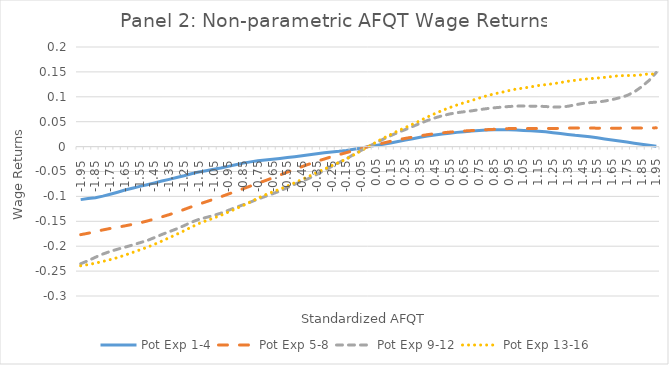
| Category | Pot Exp 1-4 | Pot Exp 5-8 | Pot Exp 9-12 | Pot Exp 13-16 |
|---|---|---|---|---|
| -1.95 | -0.106 | -0.177 | -0.235 | -0.239 |
| -1.9 | -0.104 | -0.174 | -0.229 | -0.237 |
| -1.8499999999999999 | -0.103 | -0.171 | -0.222 | -0.234 |
| -1.7999999999999998 | -0.1 | -0.167 | -0.216 | -0.231 |
| -1.7499999999999998 | -0.096 | -0.164 | -0.211 | -0.227 |
| -1.6999999999999997 | -0.092 | -0.162 | -0.206 | -0.223 |
| -1.6499999999999997 | -0.087 | -0.159 | -0.202 | -0.218 |
| -1.5999999999999996 | -0.084 | -0.156 | -0.198 | -0.213 |
| -1.5499999999999996 | -0.08 | -0.153 | -0.193 | -0.207 |
| -1.4999999999999996 | -0.077 | -0.15 | -0.189 | -0.202 |
| -1.4499999999999995 | -0.073 | -0.145 | -0.183 | -0.196 |
| -1.3999999999999995 | -0.069 | -0.141 | -0.176 | -0.19 |
| -1.3499999999999994 | -0.066 | -0.137 | -0.171 | -0.183 |
| -1.2999999999999994 | -0.062 | -0.132 | -0.165 | -0.176 |
| -1.2499999999999993 | -0.059 | -0.126 | -0.159 | -0.169 |
| -1.1999999999999993 | -0.054 | -0.121 | -0.152 | -0.162 |
| -1.1499999999999992 | -0.051 | -0.116 | -0.146 | -0.155 |
| -1.0999999999999992 | -0.048 | -0.111 | -0.142 | -0.149 |
| -1.0499999999999992 | -0.046 | -0.106 | -0.138 | -0.144 |
| -0.9999999999999991 | -0.043 | -0.101 | -0.134 | -0.138 |
| -0.9499999999999991 | -0.04 | -0.095 | -0.128 | -0.132 |
| -0.899999999999999 | -0.036 | -0.09 | -0.122 | -0.125 |
| -0.849999999999999 | -0.033 | -0.085 | -0.117 | -0.118 |
| -0.7999999999999989 | -0.031 | -0.079 | -0.111 | -0.111 |
| -0.7499999999999989 | -0.029 | -0.074 | -0.105 | -0.104 |
| -0.6999999999999988 | -0.027 | -0.068 | -0.1 | -0.097 |
| -0.6499999999999988 | -0.026 | -0.063 | -0.095 | -0.091 |
| -0.5999999999999988 | -0.024 | -0.057 | -0.089 | -0.085 |
| -0.5499999999999987 | -0.022 | -0.051 | -0.082 | -0.079 |
| -0.4999999999999987 | -0.02 | -0.046 | -0.076 | -0.073 |
| -0.44999999999999873 | -0.018 | -0.04 | -0.069 | -0.066 |
| -0.39999999999999875 | -0.016 | -0.035 | -0.063 | -0.059 |
| -0.34999999999999876 | -0.014 | -0.03 | -0.056 | -0.052 |
| -0.29999999999999877 | -0.012 | -0.025 | -0.048 | -0.045 |
| -0.24999999999999878 | -0.011 | -0.02 | -0.04 | -0.038 |
| -0.1999999999999988 | -0.009 | -0.016 | -0.032 | -0.032 |
| -0.1499999999999988 | -0.008 | -0.012 | -0.024 | -0.025 |
| -0.0999999999999988 | -0.005 | -0.008 | -0.016 | -0.017 |
| -0.049999999999998795 | -0.003 | -0.004 | -0.008 | -0.008 |
| 0.0 | 0 | 0 | 0 | 0 |
| 0.05 | 0.002 | 0.004 | 0.008 | 0.009 |
| 0.1 | 0.005 | 0.007 | 0.015 | 0.017 |
| 0.15000000000000002 | 0.007 | 0.011 | 0.022 | 0.024 |
| 0.2 | 0.01 | 0.014 | 0.028 | 0.032 |
| 0.25 | 0.013 | 0.017 | 0.034 | 0.038 |
| 0.3 | 0.016 | 0.019 | 0.041 | 0.045 |
| 0.35 | 0.019 | 0.022 | 0.047 | 0.052 |
| 0.39999999999999997 | 0.021 | 0.024 | 0.053 | 0.06 |
| 0.44999999999999996 | 0.023 | 0.026 | 0.058 | 0.066 |
| 0.49999999999999994 | 0.025 | 0.028 | 0.062 | 0.073 |
| 0.5499999999999999 | 0.027 | 0.029 | 0.066 | 0.078 |
| 0.6 | 0.029 | 0.03 | 0.068 | 0.084 |
| 0.65 | 0.03 | 0.031 | 0.07 | 0.088 |
| 0.7000000000000001 | 0.031 | 0.032 | 0.072 | 0.093 |
| 0.7500000000000001 | 0.032 | 0.033 | 0.074 | 0.097 |
| 0.8000000000000002 | 0.033 | 0.034 | 0.076 | 0.102 |
| 0.8500000000000002 | 0.034 | 0.035 | 0.078 | 0.106 |
| 0.9000000000000002 | 0.034 | 0.035 | 0.079 | 0.109 |
| 0.9500000000000003 | 0.034 | 0.036 | 0.08 | 0.112 |
| 1.0000000000000002 | 0.033 | 0.036 | 0.081 | 0.115 |
| 1.0500000000000003 | 0.033 | 0.036 | 0.081 | 0.118 |
| 1.1000000000000003 | 0.032 | 0.036 | 0.081 | 0.12 |
| 1.1500000000000004 | 0.031 | 0.036 | 0.081 | 0.123 |
| 1.2000000000000004 | 0.03 | 0.037 | 0.08 | 0.124 |
| 1.2500000000000004 | 0.028 | 0.036 | 0.079 | 0.126 |
| 1.3000000000000005 | 0.026 | 0.037 | 0.08 | 0.129 |
| 1.3500000000000005 | 0.024 | 0.037 | 0.081 | 0.131 |
| 1.4000000000000006 | 0.023 | 0.037 | 0.084 | 0.133 |
| 1.4500000000000006 | 0.021 | 0.037 | 0.087 | 0.135 |
| 1.5000000000000007 | 0.02 | 0.037 | 0.088 | 0.136 |
| 1.5500000000000007 | 0.018 | 0.037 | 0.09 | 0.138 |
| 1.6000000000000008 | 0.015 | 0.037 | 0.091 | 0.139 |
| 1.6500000000000008 | 0.013 | 0.037 | 0.094 | 0.141 |
| 1.7000000000000008 | 0.011 | 0.037 | 0.098 | 0.142 |
| 1.7500000000000009 | 0.009 | 0.038 | 0.102 | 0.143 |
| 1.800000000000001 | 0.007 | 0.038 | 0.11 | 0.143 |
| 1.850000000000001 | 0.005 | 0.037 | 0.12 | 0.144 |
| 1.900000000000001 | 0.003 | 0.037 | 0.133 | 0.146 |
| 1.950000000000001 | 0.001 | 0.038 | 0.149 | 0.145 |